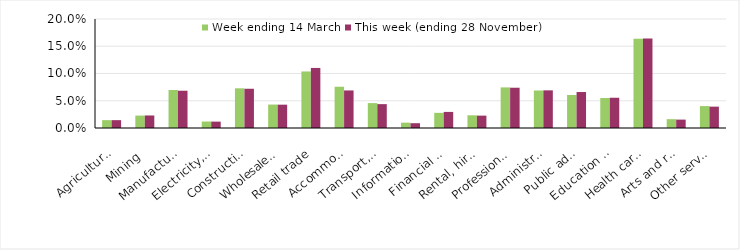
| Category | Week ending 14 March | This week (ending 28 November) |
|---|---|---|
| Agriculture, forestry and fishing | 0.014 | 0.014 |
| Mining | 0.023 | 0.023 |
| Manufacturing | 0.07 | 0.068 |
| Electricity, gas, water and waste services | 0.012 | 0.012 |
| Construction | 0.073 | 0.072 |
| Wholesale trade | 0.043 | 0.043 |
| Retail trade | 0.104 | 0.11 |
| Accommodation and food services | 0.076 | 0.069 |
| Transport, postal and warehousing | 0.046 | 0.044 |
| Information media and telecommunications | 0.01 | 0.009 |
| Financial and insurance services | 0.028 | 0.03 |
| Rental, hiring and real estate services | 0.023 | 0.023 |
| Professional, scientific and technical services | 0.074 | 0.074 |
| Administrative and support services | 0.069 | 0.069 |
| Public administration and safety | 0.061 | 0.066 |
| Education and training | 0.055 | 0.056 |
| Health care and social assistance | 0.164 | 0.164 |
| Arts and recreation services | 0.016 | 0.015 |
| Other services | 0.04 | 0.039 |